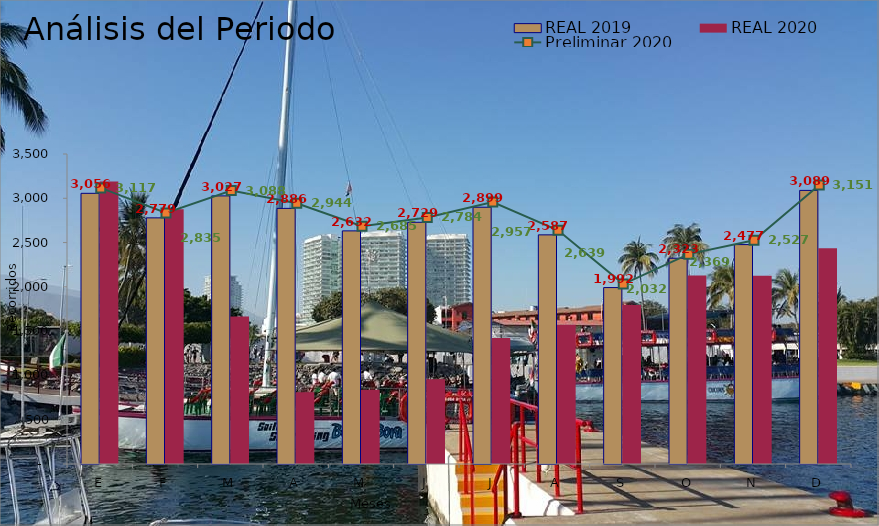
| Category | REAL 2019 | REAL 2020 |
|---|---|---|
| E | 3056 | 3189 |
| F | 2779 | 2877 |
| M | 3027 | 1665 |
| A | 2886 | 810 |
| M | 2632 | 837 |
| J | 2729 | 958 |
| J | 2899 | 1423 |
| A | 2587 | 1571 |
| S | 1992 | 1794 |
| O | 2323 | 2127 |
| N | 2477 | 2126 |
| D | 3089 | 2436 |